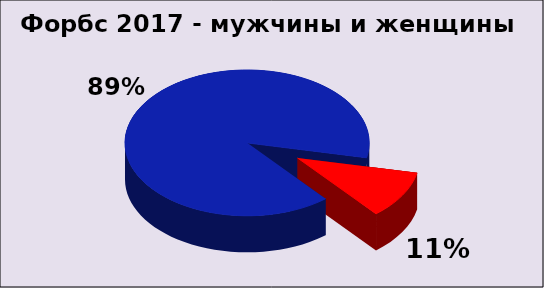
| Category | Series 0 |
|---|---|
| Мужчины | 1826 |
| Женщины | 217 |